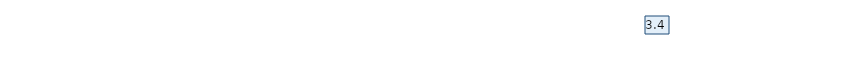
| Category | Итоговая оценка |
|---|---|
| Вопрос 5 | 3.4 |